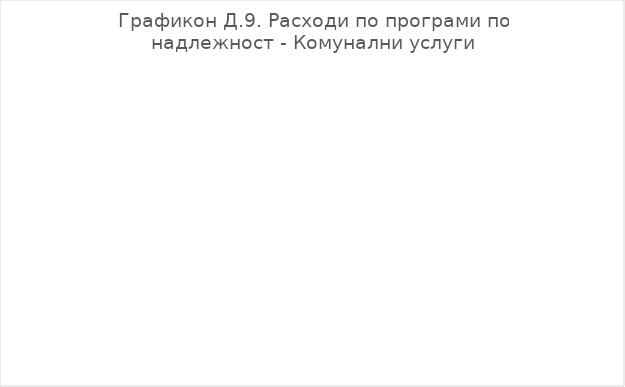
| Category | Износ |
|---|---|
| Одржување на урбана опрема | 10200000 |
| Снабдување со вода | 0 |
| Одведување и пречистување на отпадни води | 0 |
| Јавно осветлување | 11747000 |
| Јавна чистота | 1631000 |
| Одржување и заштита на локалните патишта, улици и регулирање на режим на сообраќајот | 4500000 |
| Одржување и користење на паркови и зеленило | 0 |
| Други комунални услуги | 27400000 |
| Изградба на јавно осветлување | 7000000 |
| Изградба и реконструкција на локални патишта и улици | 12000000 |
| Изградба на простори за паркирање | 0 |
| Изградба на сообраќајна сигнализација | 0 |
| Изградба на систем за водоснабдување | 6000000 |
| Изградба на систем за одведување, прочистување на отпадни води | 0 |
| Други комунални услуги | 0 |
| Паркови и зеленило | 0 |
| Урбана опрема | 1000000 |